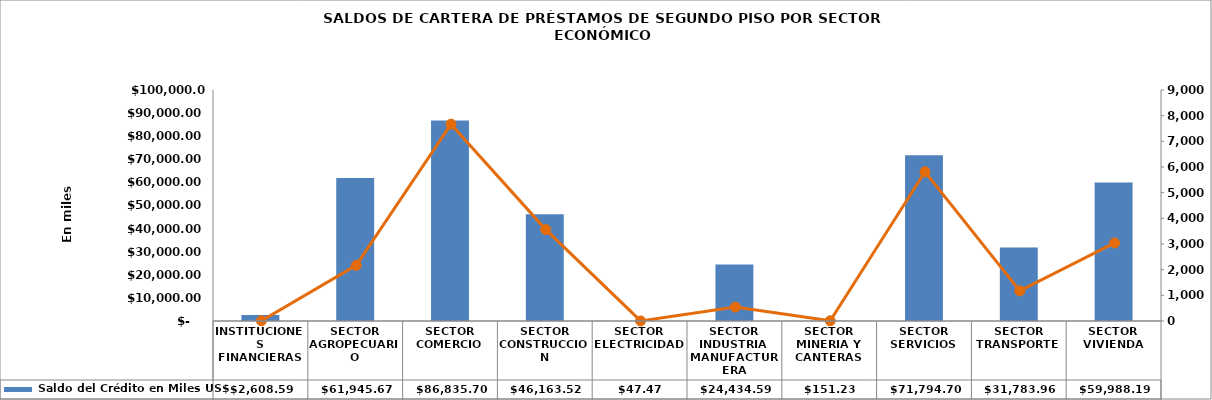
| Category |  Saldo del Crédito en Miles US$ |
|---|---|
| INSTITUCIONES FINANCIERAS | 2608.588 |
| SECTOR AGROPECUARIO | 61945.666 |
| SECTOR COMERCIO | 86835.699 |
| SECTOR CONSTRUCCION | 46163.521 |
| SECTOR ELECTRICIDAD | 47.471 |
| SECTOR INDUSTRIA MANUFACTURERA | 24434.592 |
| SECTOR MINERIA Y CANTERAS | 151.233 |
| SECTOR SERVICIOS | 71794.697 |
| SECTOR TRANSPORTE | 31783.959 |
| SECTOR VIVIENDA | 59988.192 |